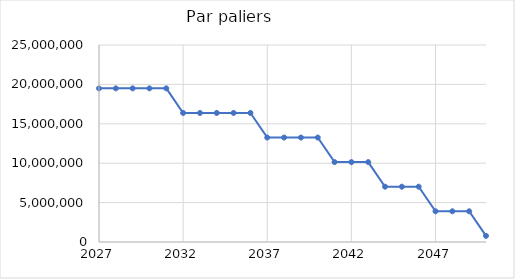
| Category | Emissions (t eqCO2) |
|---|---|
| 2027.0 | 19495584 |
| 2028.0 | 19495584 |
| 2029.0 | 19495584 |
| 2030.0 | 19495584 |
| 2031.0 | 19495584 |
| 2032.0 | 16376186.667 |
| 2033.0 | 16376186.667 |
| 2034.0 | 16376186.667 |
| 2035.0 | 16376186.667 |
| 2036.0 | 16376186.667 |
| 2037.0 | 13256789.333 |
| 2038.0 | 13256789.333 |
| 2039.0 | 13256789.333 |
| 2040.0 | 13256789.333 |
| 2041.0 | 10137392 |
| 2042.0 | 10137392 |
| 2043.0 | 10137392 |
| 2044.0 | 7017994.667 |
| 2045.0 | 7017994.667 |
| 2046.0 | 7017994.667 |
| 2047.0 | 3898597.333 |
| 2048.0 | 3898597.333 |
| 2049.0 | 3898597.333 |
| 2050.0 | 779200 |